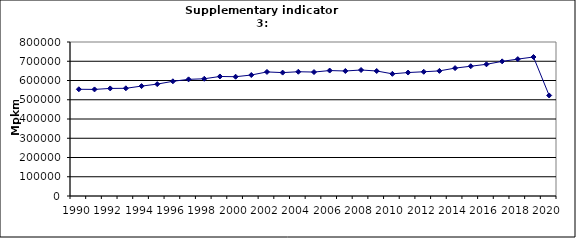
| Category | Passenger transport by cars, Mpkm |
|---|---|
| 1990 | 554446.844 |
| 1991 | 553715.364 |
| 1992 | 558844.084 |
| 1993 | 559476.779 |
| 1994 | 571018.077 |
| 1995 | 581231.361 |
| 1996 | 595924.825 |
| 1997 | 605941.938 |
| 1998 | 609086.786 |
| 1999 | 620975.331 |
| 2000 | 619612.492 |
| 2001 | 628462.659 |
| 2002 | 644507.265 |
| 2003 | 641031.601 |
| 2004 | 645483.143 |
| 2005 | 643838.571 |
| 2006 | 651672.785 |
| 2007 | 649397.603 |
| 2008 | 654532.433 |
| 2009 | 649381.954 |
| 2010 | 634632.7 |
| 2011 | 641355.012 |
| 2012 | 645392.137 |
| 2013 | 649838.319 |
| 2014 | 664412.288 |
| 2015 | 674183.036 |
| 2016 | 684093.125 |
| 2017 | 699383.8 |
| 2018 | 711199.393 |
| 2019 | 722012.16 |
| 2020 | 522256.711 |